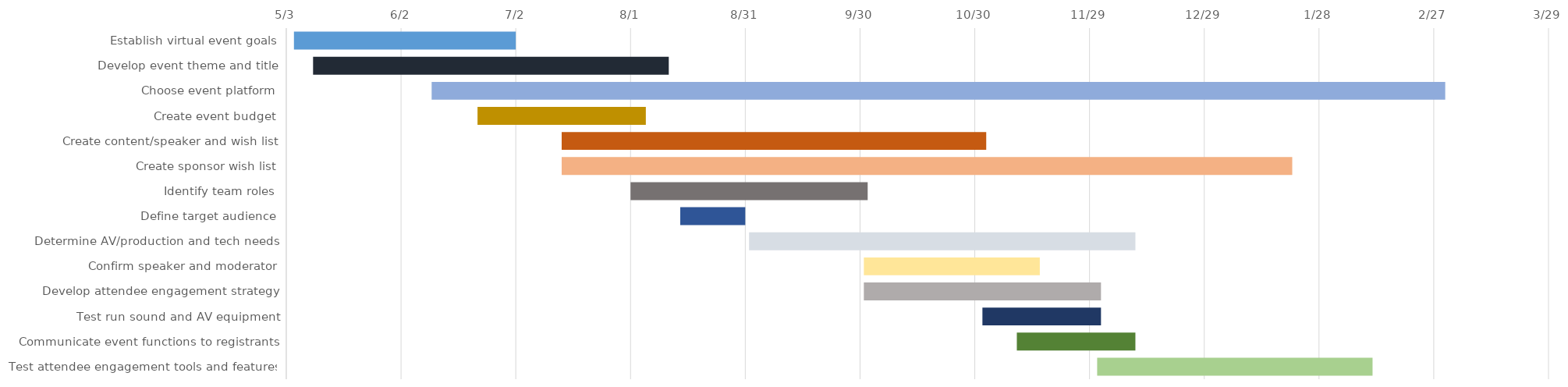
| Category | START 
DATE | Duration |
|---|---|---|
| Establish virtual event goals | 2025-05-05 | 58 |
| Develop event theme and title | 2025-05-10 | 93 |
| Choose event platform | 2025-06-10 | 265 |
| Create event budget | 2025-06-22 | 44 |
| Create content/speaker and wish list | 2025-07-14 | 111 |
| Create sponsor wish list | 2025-07-14 | 191 |
| Identify team roles | 2025-08-01 | 62 |
| Define target audience | 2025-08-14 | 17 |
| Determine AV/production and tech needs | 2025-09-01 | 101 |
| Confirm speaker and moderator | 2025-10-01 | 46 |
| Develop attendee engagement strategy | 2025-10-01 | 62 |
| Test run sound and AV equipment | 2025-11-01 | 31 |
| Communicate event functions to registrants | 2025-11-10 | 31 |
| Test attendee engagement tools and features | 2025-12-01 | 72 |